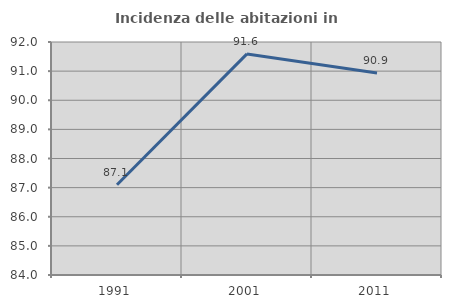
| Category | Incidenza delle abitazioni in proprietà  |
|---|---|
| 1991.0 | 87.097 |
| 2001.0 | 91.59 |
| 2011.0 | 90.936 |